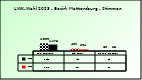
| Category | 2018 | 2023 |
|---|---|---|
| Bgld. Bauernbund | 1398 | 1175 |
| SPÖ Bauern | 490 | 284 |
| Freiheitliche Bauern | 69 | 25 |